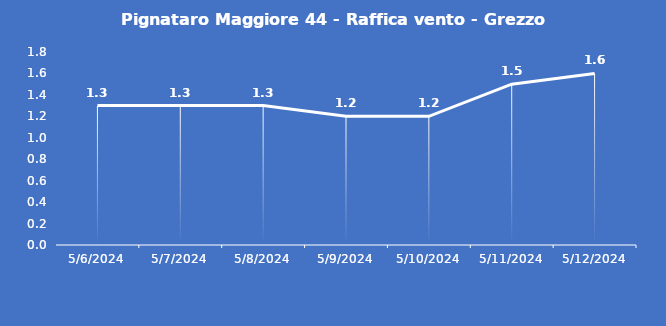
| Category | Pignataro Maggiore 44 - Raffica vento - Grezzo (m/s) |
|---|---|
| 5/6/24 | 1.3 |
| 5/7/24 | 1.3 |
| 5/8/24 | 1.3 |
| 5/9/24 | 1.2 |
| 5/10/24 | 1.2 |
| 5/11/24 | 1.5 |
| 5/12/24 | 1.6 |